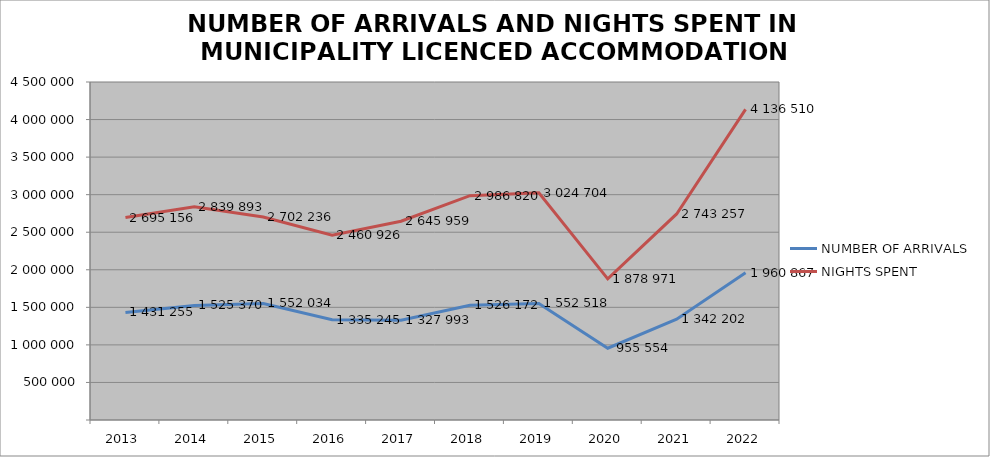
| Category | NUMBER OF ARRIVALS | NIGHTS SPENT |
|---|---|---|
| 2013 | 1431255 | 2695156 |
| 2014 | 1525370 | 2839893 |
| 2015 | 1552034 | 2702236 |
| 2016 | 1335245 | 2460926 |
| 2017 | 1327993 | 2645959 |
| 2018 | 1526172 | 2986820 |
| 2019 | 1552518 | 3024704 |
| 2020 | 955554 | 1878971 |
| 2021 | 1342202 | 2743257 |
| 2022 | 1960867 | 4136510 |